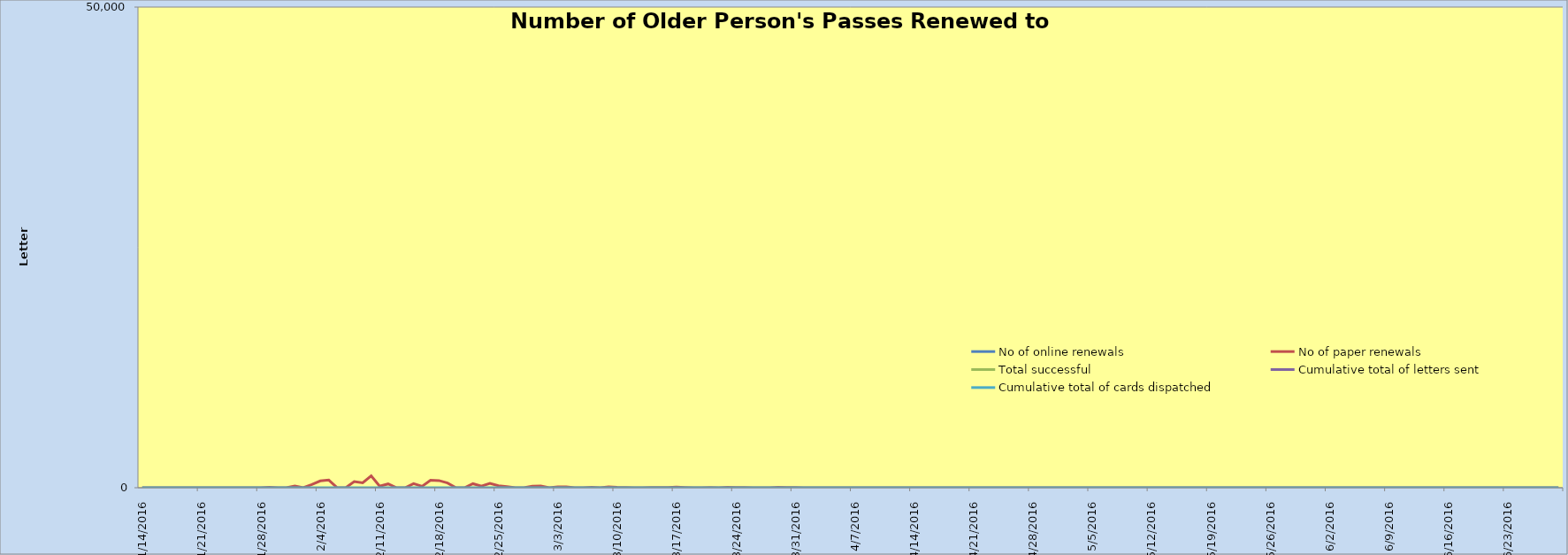
| Category | No of online renewals | No of paper renewals | Total successful | Cumulative total of letters sent  | Cumulative total of cards dispatched  |
|---|---|---|---|---|---|
| 1/14/16 |  | 0 |  |  | 0 |
| 1/15/16 |  | 0 |  |  | 0 |
| 1/16/16 |  | 0 |  |  | 0 |
| 1/17/16 |  | 0 |  |  | 0 |
| 1/18/16 |  | 0 |  |  | 0 |
| 1/19/16 |  | 0 |  |  | 0 |
| 1/20/16 |  | 0 |  |  | 0 |
| 1/21/16 |  | 0 |  |  | 0 |
| 1/22/16 |  | 0 |  |  | 0 |
| 1/23/16 |  | 0 |  |  | 0 |
| 1/24/16 |  | 0 |  |  | 0 |
| 1/25/16 |  | 0 |  |  | 0 |
| 1/26/16 |  | 6 |  |  | 0 |
| 1/27/16 |  | 1 |  |  | 0 |
| 1/28/16 |  | 2 |  |  | 0 |
| 1/29/16 |  | 50 |  |  | 0 |
| 1/30/16 |  | 0 |  |  | 0 |
| 1/31/16 |  | 0 |  |  | 0 |
| 2/1/16 |  | 178 |  |  | 0 |
| 2/2/16 |  | 0 |  |  | 0 |
| 2/3/16 |  | 334 |  |  | 0 |
| 2/4/16 |  | 705 |  |  | 0 |
| 2/5/16 |  | 794 |  |  | 0 |
| 2/6/16 |  | 0 |  |  | 0 |
| 2/7/16 |  | 0 |  |  | 0 |
| 2/8/16 |  | 644 |  |  | 0 |
| 2/9/16 |  | 508 |  |  | 0 |
| 2/10/16 |  | 1237 |  |  | 0 |
| 2/11/16 |  | 160 |  |  | 0 |
| 2/12/16 |  | 398 |  |  | 0 |
| 2/13/16 |  | 0 |  |  | 0 |
| 2/14/16 |  | 0 |  |  | 0 |
| 2/15/16 |  | 427 |  |  | 0 |
| 2/16/16 |  | 150 |  |  | 0 |
| 2/17/16 |  | 786 |  |  | 0 |
| 2/18/16 |  | 744 |  |  | 0 |
| 2/19/16 |  | 492 |  |  | 0 |
| 2/20/16 |  | 0 |  |  | 0 |
| 2/21/16 |  | 0 |  |  | 0 |
| 2/22/16 |  | 420 |  |  | 0 |
| 2/23/16 |  | 164 |  |  | 0 |
| 2/24/16 |  | 456 |  |  | 0 |
| 2/25/16 |  | 205 |  |  | 0 |
| 2/26/16 |  | 116 |  |  | 0 |
| 2/27/16 |  | 0 |  |  | 0 |
| 2/28/16 |  | 0 |  |  | 0 |
| 2/29/16 |  | 152 |  |  | 0 |
| 3/1/16 |  | 184 |  |  | 0 |
| 3/2/16 |  | 11 |  |  | 0 |
| 3/3/16 |  | 91 |  |  | 0 |
| 3/4/16 |  | 83 |  |  | 0 |
| 3/5/16 |  | 0 |  |  | 0 |
| 3/6/16 |  | 0 |  |  | 0 |
| 3/7/16 |  | 47 |  |  | 0 |
| 3/8/16 |  | 0 |  |  | 0 |
| 3/9/16 |  | 89 |  |  | 0 |
| 3/10/16 |  | 35 |  |  | 0 |
| 3/11/16 |  | 30 |  |  | 0 |
| 3/12/16 |  | 0 |  |  | 0 |
| 3/13/16 |  | 0 |  |  | 0 |
| 3/14/16 |  | 29 |  |  | 0 |
| 3/15/16 |  | 32 |  |  | 0 |
| 3/16/16 |  | 15 |  |  | 0 |
| 3/17/16 |  | 62 |  |  | 0 |
| 3/18/16 |  | 30 |  |  | 0 |
| 3/19/16 |  | 0 |  |  | 0 |
| 3/20/16 |  | 0 |  |  | 0 |
| 3/21/16 |  | 34 |  |  | 0 |
| 3/22/16 |  | 4 |  |  | 0 |
| 3/23/16 |  | 55 |  |  | 0 |
| 3/24/16 |  | 23 |  |  | 0 |
| 3/25/16 |  | 21 |  |  | 0 |
| 3/26/16 |  | 0 |  |  | 0 |
| 3/27/16 |  | 0 |  |  | 0 |
| 3/28/16 |  | 0 |  |  | 0 |
| 3/29/16 |  | 57 |  |  | 0 |
| 3/30/16 |  | 18 |  |  | 0 |
| 3/31/16 |  | 17 |  |  | 0 |
| 4/1/16 |  | 0 |  |  | 0 |
| 4/2/16 |  | 0 |  |  | 0 |
| 4/3/16 |  | 0 |  |  | 0 |
| 4/4/16 |  | 0 |  |  | 0 |
| 4/5/16 |  | 0 |  |  | 0 |
| 4/6/16 |  | 0 |  |  | 0 |
| 4/7/16 |  | 0 |  |  | 0 |
| 4/8/16 |  | 0 |  |  | 0 |
| 4/9/16 |  | 0 |  |  | 0 |
| 4/10/16 |  | 0 |  |  | 0 |
| 4/11/16 |  | 0 |  |  | 0 |
| 4/12/16 |  | 0 |  |  | 0 |
| 4/13/16 |  | 0 |  |  | 0 |
| 4/14/16 |  | 0 |  |  | 0 |
| 4/15/16 |  | 0 |  |  | 0 |
| 4/16/16 |  | 0 |  |  | 0 |
| 4/17/16 |  | 0 |  |  | 0 |
| 4/18/16 |  | 0 |  |  | 0 |
| 4/19/16 |  | 0 |  |  | 0 |
| 4/20/16 |  | 0 |  |  | 0 |
| 4/21/16 |  | 0 |  |  | 0 |
| 4/22/16 |  | 0 |  |  | 0 |
| 4/23/16 |  | 0 |  |  | 0 |
| 4/24/16 |  | 0 |  |  | 0 |
| 4/25/16 |  | 0 |  |  | 0 |
| 4/26/16 |  | 0 |  |  | 0 |
| 4/27/16 |  | 0 |  |  | 0 |
| 4/28/16 |  | 0 |  |  | 0 |
| 4/29/16 |  | 0 |  |  | 0 |
| 4/30/16 |  | 0 |  |  | 0 |
| 5/1/16 |  | 0 |  |  | 0 |
| 5/2/16 |  | 0 |  |  | 0 |
| 5/3/16 |  | 0 |  |  | 0 |
| 5/4/16 |  | 0 |  |  | 0 |
| 5/5/16 |  | 0 |  |  | 0 |
| 5/6/16 |  | 0 |  |  | 0 |
| 5/7/16 |  | 0 |  |  | 0 |
| 5/8/16 |  | 0 |  |  | 0 |
| 5/9/16 |  | 0 |  |  | 0 |
| 5/10/16 |  | 0 |  |  | 0 |
| 5/11/16 |  | 0 |  |  | 0 |
| 5/12/16 |  | 0 |  |  | 0 |
| 5/13/16 |  | 0 |  |  | 0 |
| 5/14/16 |  | 0 |  |  | 0 |
| 5/15/16 |  | 0 |  |  | 0 |
| 5/16/16 |  | 0 |  |  | 0 |
| 5/17/16 |  | 0 |  |  | 0 |
| 5/18/16 |  | 0 |  |  | 0 |
| 5/19/16 |  | 0 |  |  | 0 |
| 5/20/16 |  | 0 |  |  | 0 |
| 5/21/16 |  | 0 |  |  | 0 |
| 5/22/16 |  | 0 |  |  | 0 |
| 5/23/16 |  | 0 |  |  | 0 |
| 5/24/16 |  | 0 |  |  | 0 |
| 5/25/16 |  | 0 |  |  | 0 |
| 5/26/16 |  | 0 |  |  | 0 |
| 5/27/16 |  | 0 |  |  | 0 |
| 5/28/16 |  | 0 |  |  | 0 |
| 5/29/16 |  | 0 |  |  | 0 |
| 5/30/16 |  | 0 |  |  | 0 |
| 5/31/16 |  | 0 |  |  | 0 |
| 6/1/16 |  | 0 |  |  | 0 |
| 6/2/16 |  | 0 |  |  | 0 |
| 6/3/16 |  | 0 |  |  | 0 |
| 6/4/16 |  | 0 |  |  | 0 |
| 6/5/16 |  | 0 |  |  | 0 |
| 6/6/16 |  | 0 |  |  | 0 |
| 6/7/16 |  | 0 |  |  | 0 |
| 6/8/16 |  | 0 |  |  | 0 |
| 6/9/16 |  | 0 |  |  | 0 |
| 6/10/16 |  | 0 |  |  | 0 |
| 6/11/16 |  | 0 |  |  | 0 |
| 6/12/16 |  | 0 |  |  | 0 |
| 6/13/16 |  | 0 |  |  | 0 |
| 6/14/16 |  | 0 |  |  | 0 |
| 6/15/16 |  | 0 |  |  | 0 |
| 6/16/16 |  | 0 |  |  | 0 |
| 6/17/16 |  | 0 |  |  | 0 |
| 6/18/16 |  | 0 |  |  | 0 |
| 6/19/16 |  | 0 |  |  | 0 |
| 6/20/16 |  | 0 |  |  | 0 |
| 6/21/16 |  | 0 |  |  | 0 |
| 6/22/16 |  | 0 |  |  | 0 |
| 6/23/16 |  | 0 |  |  | 0 |
| 6/24/16 |  | 0 |  |  | 0 |
| 6/25/16 |  | 0 |  |  | 0 |
| 6/26/16 |  | 0 |  |  | 0 |
| 6/27/16 |  | 0 |  |  | 0 |
| 6/28/16 |  | 0 |  |  | 0 |
| 6/29/16 |  | 0 |  |  | 0 |